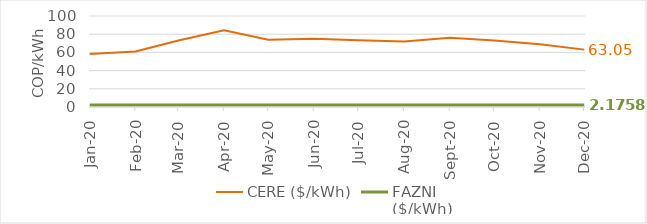
| Category | CERE ($/kWh) | FAZNI
($/kWh) |
|---|---|---|
| 2020-01-01 | 58.301 | 2.176 |
| 2020-02-01 | 61.038 | 2.176 |
| 2020-03-01 | 73.053 | 2.176 |
| 2020-04-01 | 84.43 | 2.176 |
| 2020-05-01 | 73.946 | 2.176 |
| 2020-06-01 | 74.91 | 2.176 |
| 2020-07-01 | 73.219 | 2.176 |
| 2020-08-01 | 72.018 | 2.176 |
| 2020-09-01 | 76.136 | 2.176 |
| 2020-10-01 | 73.124 | 2.176 |
| 2020-11-01 | 68.888 | 2.176 |
| 2020-12-01 | 63.045 | 2.176 |